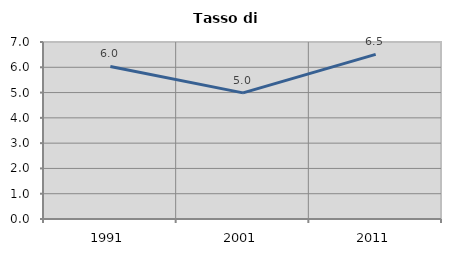
| Category | Tasso di disoccupazione   |
|---|---|
| 1991.0 | 6.032 |
| 2001.0 | 4.989 |
| 2011.0 | 6.512 |